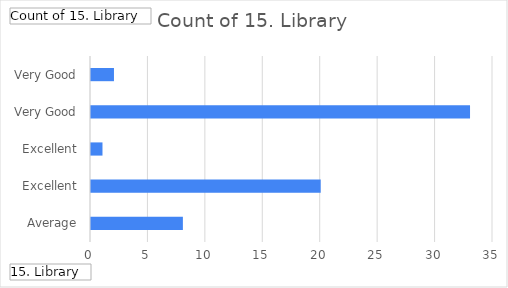
| Category | Total |
|---|---|
| Average | 8 |
| Excellent | 20 |
| Excellent, Very Good | 1 |
| Very Good | 33 |
| Very Good, Average | 2 |